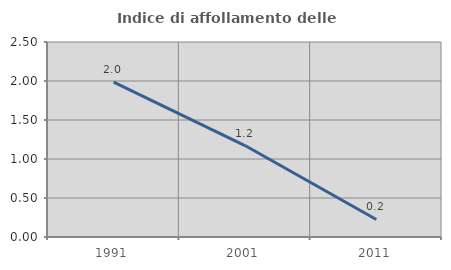
| Category | Indice di affollamento delle abitazioni  |
|---|---|
| 1991.0 | 1.986 |
| 2001.0 | 1.173 |
| 2011.0 | 0.225 |